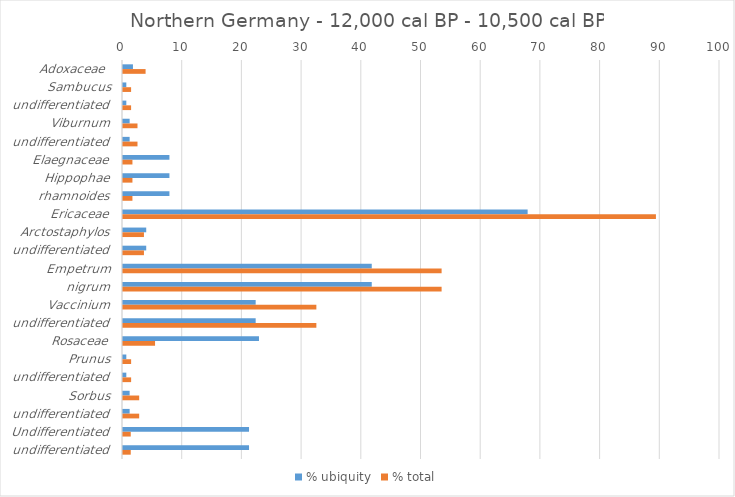
| Category | % ubiquity | % total |
|---|---|---|
| Adoxaceae  | 1.667 | 3.783 |
| Sambucus | 0.556 | 1.356 |
| undifferentiated | 0.556 | 1.356 |
| Viburnum | 1.111 | 2.428 |
| undifferentiated | 1.111 | 2.428 |
| Elaegnaceae | 7.778 | 1.581 |
| Hippophae | 7.778 | 1.581 |
| rhamnoides | 7.778 | 1.581 |
| Ericaceae | 67.778 | 89.267 |
| Arctostaphylos | 3.889 | 3.509 |
| undifferentiated | 3.889 | 3.509 |
| Empetrum | 41.667 | 53.369 |
| nigrum | 41.667 | 53.369 |
| Vaccinium | 22.222 | 32.389 |
| undifferentiated | 22.222 | 32.389 |
| Rosaceae | 22.778 | 5.369 |
| Prunus | 0.556 | 1.36 |
| undifferentiated | 0.556 | 1.36 |
| Sorbus | 1.111 | 2.712 |
| undifferentiated | 1.111 | 2.712 |
| Undifferentiated | 21.111 | 1.297 |
| undifferentiated | 21.111 | 1.297 |